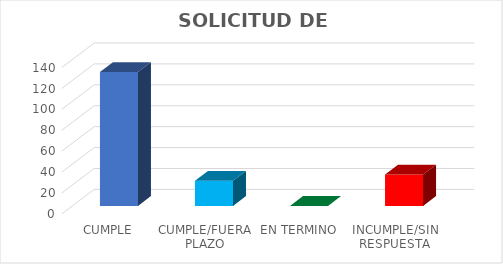
| Category | Series 0 |
|---|---|
| CUMPLE | 128 |
| CUMPLE/FUERA PLAZO | 24 |
| EN TERMINO | 0 |
| INCUMPLE/SIN RESPUESTA | 30 |